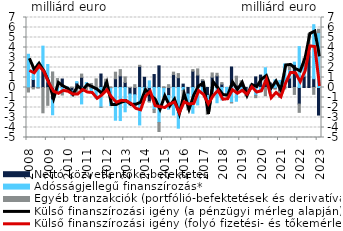
| Category | Nettó közvetlentőke-befektetés | Adósságjellegű finanszírozás* | Egyéb tranzakciók (portfólió-befektetések és derivatívák) |
|---|---|---|---|
| 2008.0 | -0.034 | 3.322 | -0.418 |
| 2008.0 | 0.803 | 1.088 | -0.143 |
| 2008.0 | -0.018 | 2.427 | -0.031 |
| 2008.0 | 1.693 | 2.442 | -2.531 |
| 2009.0 | 0.563 | 1.733 | -1.782 |
| 2009.0 | -1.245 | -1.481 | 1.555 |
| 2009.0 | 0.091 | -0.441 | 0.803 |
| 2009.0 | 0.849 | -0.524 | -0.23 |
| 2010.0 | -0.106 | 0.064 | -0.101 |
| 2010.0 | -0.335 | -0.45 | 0.042 |
| 2010.0 | 0.464 | 0.133 | -0.497 |
| 2010.0 | 1.022 | -1.641 | 0.32 |
| 2011.0 | 0.162 | 0.326 | -0.226 |
| 2011.0 | -0.116 | -0.264 | 0.405 |
| 2011.0 | -0.244 | -0.837 | 0.865 |
| 2011.0 | 1.349 | -1.961 | -0.027 |
| 2012.0 | 0.56 | -0.352 | 0.274 |
| 2012.0 | -0.042 | -1.764 | 0.061 |
| 2012.0 | 0.874 | -3.272 | 0.657 |
| 2012.0 | 1.166 | -3.304 | 0.621 |
| 2013.0 | 0.497 | -2.429 | 0.564 |
| 2013.0 | -0.651 | -1.108 | 0.016 |
| 2013.0 | -0.73 | -1.279 | 0.283 |
| 2013.0 | 2.115 | -3.746 | 0.106 |
| 2014.0 | 1.023 | -0.915 | -0.357 |
| 2014.0 | -1.403 | 0.662 | -0.06 |
| 2014.0 | 1.296 | -2.188 | -0.319 |
| 2014.0 | 2.162 | -3.495 | -0.903 |
| 2015.0 | -0.029 | -0.924 | 0.079 |
| 2015.0 | -0.806 | -1.374 | 0.283 |
| 2015.0 | 1.293 | -2.748 | 0.242 |
| 2015.0 | 0.981 | -4.068 | 0.413 |
| 2016.0 | 0.34 | -0.3 | -0.689 |
| 2016.0 | -0.651 | -1.305 | -0.283 |
| 2016.0 | 1.63 | -2.575 | 0.164 |
| 2016.0 | 1.244 | -1.739 | 0.616 |
| 2017.0 | 0.716 | -0.382 | 0.071 |
| 2017.0 | -0.797 | -1.334 | -0.552 |
| 2017.0 | 1.032 | -0.941 | 0.422 |
| 2017.0 | 1.164 | -1.523 | 0.258 |
| 2018.0 | 0.329 | -1.244 | 0.168 |
| 2018.0 | 0 | -0.637 | -0.19 |
| 2018.0 | 2.05 | -1.506 | -0.041 |
| 2018.0 | 0.233 | -1.376 | 0.896 |
| 2019.0 | 0.383 | -0.202 | 0.289 |
| 2019.0 | -0.641 | -0.019 | -0.191 |
| 2019.0 | 0.099 | 0.116 | 0.031 |
| 2019.0 | 1.061 | -0.786 | -0.229 |
| 2020.0 | 1.242 | -0.359 | -0.089 |
| 2020.0 | 0.774 | 1.201 | -0.827 |
| 2020.0 | 0.451 | -0.423 | -0.128 |
| 2020.0 | -0.117 | 0.763 | -0.039 |
| 2021.0 | -0.36 | 0.709 | -0.639 |
| 2021.0 | 0.056 | 2.297 | -0.15 |
| 2021.0 | 0.952 | 0.846 | 0.46 |
| 2021.0 | 2.311 | 0.222 | -0.691 |
| 2022.0 | -1.654 | 4.092 | -0.832 |
| 2022.0 | 1.127 | 1.015 | 0.76 |
| 2022.0 | 3.522 | 0.477 | 1.356 |
| 2022.0 | 0.88 | 5.4 | -0.683 |
| 2023.0 | -2.757 | 5.486 | 0.339 |